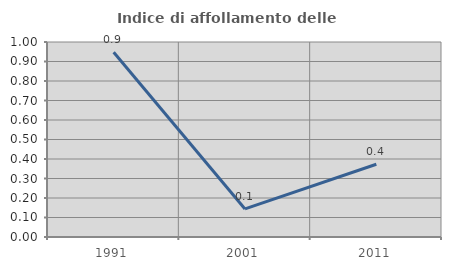
| Category | Indice di affollamento delle abitazioni  |
|---|---|
| 1991.0 | 0.948 |
| 2001.0 | 0.144 |
| 2011.0 | 0.373 |